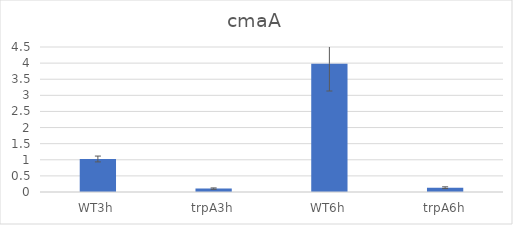
| Category | Series 0 |
|---|---|
| WT3h | 1.025 |
| trpA3h | 0.105 |
| WT6h | 3.978 |
| trpA6h | 0.134 |